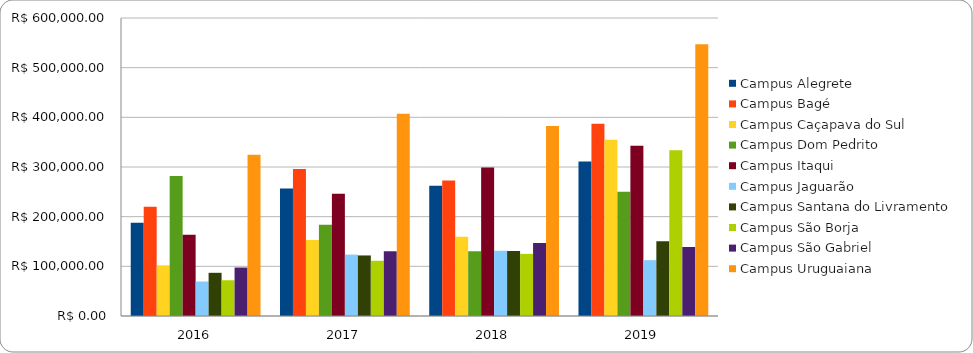
| Category | Campus Alegrete | Campus Bagé | Campus Caçapava do Sul | Campus Dom Pedrito | Campus Itaqui | Campus Jaguarão | Campus Santana do Livramento | Campus São Borja | Campus São Gabriel | Campus Uruguaiana |
|---|---|---|---|---|---|---|---|---|---|---|
| 2016.0 | 187938.8 | 220000 | 101780 | 281709.5 | 163471.18 | 69414.66 | 86971.16 | 71955.16 | 97597.64 | 324855.82 |
| 2017.0 | 256571.25 | 295751.44 | 153230.81 | 183749.31 | 246366.49 | 123644.13 | 121909.05 | 111169.58 | 130347.65 | 407355.82 |
| 2018.0 | 262111.97 | 272822.8 | 159720.22 | 130306.06 | 298995.04 | 131470.57 | 130915.16 | 125126.21 | 146926.32 | 382525.44 |
| 2019.0 | 310924.23 | 386951.56 | 354931.33 | 250169.97 | 342557.12 | 112423.75 | 150339.16 | 333722.34 | 138783.4 | 547115.57 |